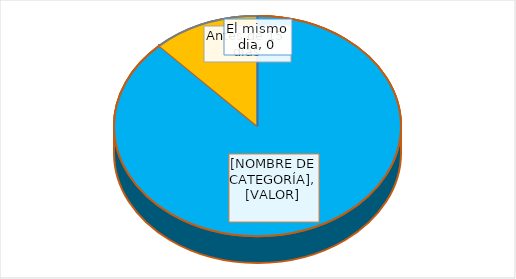
| Category | Series 0 |
|---|---|
| El mismo dia | 0 |
| Antes de 9 días | 88 |
| Antes de 15 días | 12 |